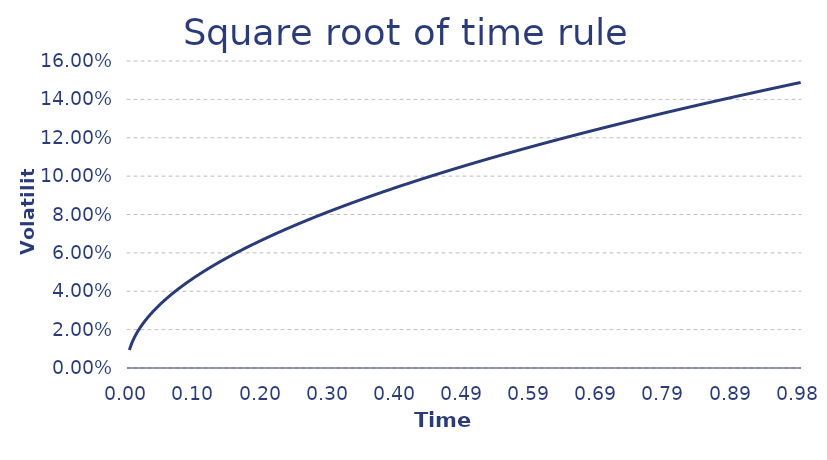
| Category | Series 0 |
|---|---|
| 0.00392156862745098 | 0.009 |
| 0.00784313725490196 | 0.013 |
| 0.011764705882352941 | 0.016 |
| 0.01568627450980392 | 0.019 |
| 0.0196078431372549 | 0.021 |
| 0.023529411764705882 | 0.023 |
| 0.027450980392156862 | 0.025 |
| 0.03137254901960784 | 0.027 |
| 0.03529411764705882 | 0.028 |
| 0.0392156862745098 | 0.03 |
| 0.043137254901960784 | 0.031 |
| 0.047058823529411764 | 0.033 |
| 0.050980392156862744 | 0.034 |
| 0.054901960784313725 | 0.035 |
| 0.058823529411764705 | 0.036 |
| 0.06274509803921569 | 0.038 |
| 0.06666666666666667 | 0.039 |
| 0.07058823529411765 | 0.04 |
| 0.07450980392156863 | 0.041 |
| 0.0784313725490196 | 0.042 |
| 0.08235294117647059 | 0.043 |
| 0.08627450980392157 | 0.044 |
| 0.09019607843137255 | 0.045 |
| 0.09411764705882353 | 0.046 |
| 0.09803921568627451 | 0.047 |
| 0.10196078431372549 | 0.048 |
| 0.10588235294117647 | 0.049 |
| 0.10980392156862745 | 0.05 |
| 0.11372549019607843 | 0.051 |
| 0.11764705882352941 | 0.051 |
| 0.12156862745098039 | 0.052 |
| 0.12549019607843137 | 0.053 |
| 0.12941176470588234 | 0.054 |
| 0.1333333333333333 | 0.055 |
| 0.13725490196078427 | 0.056 |
| 0.14117647058823524 | 0.056 |
| 0.1450980392156862 | 0.057 |
| 0.14901960784313717 | 0.058 |
| 0.15294117647058814 | 0.059 |
| 0.1568627450980391 | 0.059 |
| 0.16078431372549007 | 0.06 |
| 0.16470588235294104 | 0.061 |
| 0.168627450980392 | 0.062 |
| 0.17254901960784297 | 0.062 |
| 0.17647058823529393 | 0.063 |
| 0.1803921568627449 | 0.064 |
| 0.18431372549019587 | 0.064 |
| 0.18823529411764683 | 0.065 |
| 0.1921568627450978 | 0.066 |
| 0.19607843137254877 | 0.066 |
| 0.19999999999999973 | 0.067 |
| 0.2039215686274507 | 0.068 |
| 0.20784313725490167 | 0.068 |
| 0.21176470588235263 | 0.069 |
| 0.2156862745098036 | 0.07 |
| 0.21960784313725457 | 0.07 |
| 0.22352941176470553 | 0.071 |
| 0.2274509803921565 | 0.072 |
| 0.23137254901960747 | 0.072 |
| 0.23529411764705843 | 0.073 |
| 0.2392156862745094 | 0.073 |
| 0.24313725490196036 | 0.074 |
| 0.24705882352941133 | 0.075 |
| 0.2509803921568623 | 0.075 |
| 0.25490196078431326 | 0.076 |
| 0.25882352941176423 | 0.076 |
| 0.2627450980392152 | 0.077 |
| 0.26666666666666616 | 0.077 |
| 0.27058823529411713 | 0.078 |
| 0.2745098039215681 | 0.079 |
| 0.27843137254901906 | 0.079 |
| 0.28235294117647003 | 0.08 |
| 0.286274509803921 | 0.08 |
| 0.29019607843137196 | 0.081 |
| 0.29411764705882293 | 0.081 |
| 0.2980392156862739 | 0.082 |
| 0.30196078431372486 | 0.082 |
| 0.30588235294117583 | 0.083 |
| 0.3098039215686268 | 0.083 |
| 0.31372549019607776 | 0.084 |
| 0.3176470588235287 | 0.085 |
| 0.3215686274509797 | 0.085 |
| 0.32549019607843066 | 0.086 |
| 0.3294117647058816 | 0.086 |
| 0.3333333333333326 | 0.087 |
| 0.33725490196078356 | 0.087 |
| 0.3411764705882345 | 0.088 |
| 0.3450980392156855 | 0.088 |
| 0.34901960784313646 | 0.089 |
| 0.3529411764705874 | 0.089 |
| 0.3568627450980384 | 0.09 |
| 0.36078431372548936 | 0.09 |
| 0.3647058823529403 | 0.091 |
| 0.3686274509803913 | 0.091 |
| 0.37254901960784226 | 0.092 |
| 0.3764705882352932 | 0.092 |
| 0.3803921568627442 | 0.093 |
| 0.38431372549019516 | 0.093 |
| 0.3882352941176461 | 0.093 |
| 0.3921568627450971 | 0.094 |
| 0.39607843137254806 | 0.094 |
| 0.399999999999999 | 0.095 |
| 0.40392156862745 | 0.095 |
| 0.40784313725490096 | 0.096 |
| 0.4117647058823519 | 0.096 |
| 0.4156862745098029 | 0.097 |
| 0.41960784313725386 | 0.097 |
| 0.4235294117647048 | 0.098 |
| 0.4274509803921558 | 0.098 |
| 0.43137254901960675 | 0.099 |
| 0.4352941176470577 | 0.099 |
| 0.4392156862745087 | 0.099 |
| 0.44313725490195965 | 0.1 |
| 0.4470588235294106 | 0.1 |
| 0.4509803921568616 | 0.101 |
| 0.45490196078431255 | 0.101 |
| 0.4588235294117635 | 0.102 |
| 0.4627450980392145 | 0.102 |
| 0.46666666666666545 | 0.102 |
| 0.4705882352941164 | 0.103 |
| 0.4745098039215674 | 0.103 |
| 0.47843137254901835 | 0.104 |
| 0.4823529411764693 | 0.104 |
| 0.4862745098039203 | 0.105 |
| 0.49019607843137125 | 0.105 |
| 0.4941176470588222 | 0.105 |
| 0.4980392156862732 | 0.106 |
| 0.5019607843137242 | 0.106 |
| 0.5058823529411751 | 0.107 |
| 0.5098039215686261 | 0.107 |
| 0.513725490196077 | 0.108 |
| 0.517647058823528 | 0.108 |
| 0.521568627450979 | 0.108 |
| 0.52549019607843 | 0.109 |
| 0.5294117647058809 | 0.109 |
| 0.5333333333333319 | 0.11 |
| 0.5372549019607828 | 0.11 |
| 0.5411764705882338 | 0.11 |
| 0.5450980392156848 | 0.111 |
| 0.5490196078431357 | 0.111 |
| 0.5529411764705867 | 0.112 |
| 0.5568627450980377 | 0.112 |
| 0.5607843137254886 | 0.112 |
| 0.5647058823529396 | 0.113 |
| 0.5686274509803906 | 0.113 |
| 0.5725490196078415 | 0.114 |
| 0.5764705882352925 | 0.114 |
| 0.5803921568627435 | 0.114 |
| 0.5843137254901944 | 0.115 |
| 0.5882352941176454 | 0.115 |
| 0.5921568627450964 | 0.115 |
| 0.5960784313725473 | 0.116 |
| 0.5999999999999983 | 0.116 |
| 0.6039215686274493 | 0.117 |
| 0.6078431372549002 | 0.117 |
| 0.6117647058823512 | 0.117 |
| 0.6156862745098022 | 0.118 |
| 0.6196078431372531 | 0.118 |
| 0.6235294117647041 | 0.118 |
| 0.6274509803921551 | 0.119 |
| 0.631372549019606 | 0.119 |
| 0.635294117647057 | 0.12 |
| 0.639215686274508 | 0.12 |
| 0.6431372549019589 | 0.12 |
| 0.6470588235294099 | 0.121 |
| 0.6509803921568609 | 0.121 |
| 0.6549019607843118 | 0.121 |
| 0.6588235294117628 | 0.122 |
| 0.6627450980392138 | 0.122 |
| 0.6666666666666647 | 0.122 |
| 0.6705882352941157 | 0.123 |
| 0.6745098039215667 | 0.123 |
| 0.6784313725490176 | 0.124 |
| 0.6823529411764686 | 0.124 |
| 0.6862745098039196 | 0.124 |
| 0.6901960784313705 | 0.125 |
| 0.6941176470588215 | 0.125 |
| 0.6980392156862725 | 0.125 |
| 0.7019607843137234 | 0.126 |
| 0.7058823529411744 | 0.126 |
| 0.7098039215686254 | 0.126 |
| 0.7137254901960763 | 0.127 |
| 0.7176470588235273 | 0.127 |
| 0.7215686274509783 | 0.127 |
| 0.7254901960784292 | 0.128 |
| 0.7294117647058802 | 0.128 |
| 0.7333333333333312 | 0.128 |
| 0.7372549019607821 | 0.129 |
| 0.7411764705882331 | 0.129 |
| 0.7450980392156841 | 0.129 |
| 0.749019607843135 | 0.13 |
| 0.752941176470586 | 0.13 |
| 0.756862745098037 | 0.13 |
| 0.7607843137254879 | 0.131 |
| 0.7647058823529389 | 0.131 |
| 0.7686274509803899 | 0.132 |
| 0.7725490196078408 | 0.132 |
| 0.7764705882352918 | 0.132 |
| 0.7803921568627428 | 0.133 |
| 0.7843137254901937 | 0.133 |
| 0.7882352941176447 | 0.133 |
| 0.7921568627450957 | 0.134 |
| 0.7960784313725466 | 0.134 |
| 0.7999999999999976 | 0.134 |
| 0.8039215686274486 | 0.134 |
| 0.8078431372548995 | 0.135 |
| 0.8117647058823505 | 0.135 |
| 0.8156862745098015 | 0.135 |
| 0.8196078431372524 | 0.136 |
| 0.8235294117647034 | 0.136 |
| 0.8274509803921544 | 0.136 |
| 0.8313725490196053 | 0.137 |
| 0.8352941176470563 | 0.137 |
| 0.8392156862745073 | 0.137 |
| 0.8431372549019582 | 0.138 |
| 0.8470588235294092 | 0.138 |
| 0.8509803921568602 | 0.138 |
| 0.8549019607843111 | 0.139 |
| 0.8588235294117621 | 0.139 |
| 0.8627450980392131 | 0.139 |
| 0.866666666666664 | 0.14 |
| 0.870588235294115 | 0.14 |
| 0.874509803921566 | 0.14 |
| 0.8784313725490169 | 0.141 |
| 0.8823529411764679 | 0.141 |
| 0.8862745098039189 | 0.141 |
| 0.8901960784313698 | 0.142 |
| 0.8941176470588208 | 0.142 |
| 0.8980392156862718 | 0.142 |
| 0.9019607843137227 | 0.142 |
| 0.9058823529411737 | 0.143 |
| 0.9098039215686247 | 0.143 |
| 0.9137254901960756 | 0.143 |
| 0.9176470588235266 | 0.144 |
| 0.9215686274509776 | 0.144 |
| 0.9254901960784285 | 0.144 |
| 0.9294117647058795 | 0.145 |
| 0.9333333333333305 | 0.145 |
| 0.9372549019607814 | 0.145 |
| 0.9411764705882324 | 0.146 |
| 0.9450980392156834 | 0.146 |
| 0.9490196078431343 | 0.146 |
| 0.9529411764705853 | 0.146 |
| 0.9568627450980363 | 0.147 |
| 0.9607843137254872 | 0.147 |
| 0.9647058823529382 | 0.147 |
| 0.9686274509803892 | 0.148 |
| 0.9725490196078401 | 0.148 |
| 0.9764705882352911 | 0.148 |
| 0.9803921568627421 | 0.149 |
| 0.984313725490193 | 0.149 |